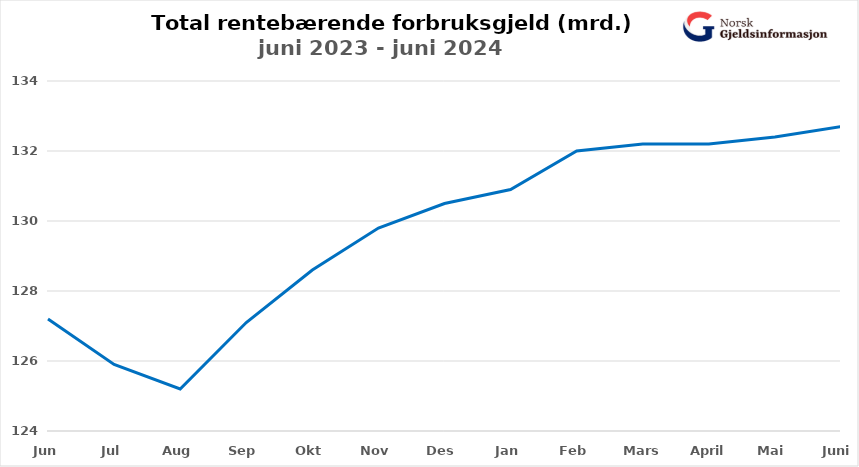
| Category | Rentebærende forbruksgjeld |
|---|---|
| Jun | 127.2 |
| Jul | 125.9 |
| Aug | 125.2 |
| Sep | 127.1 |
| Okt | 128.6 |
| Nov | 129.8 |
| Des | 130.5 |
| Jan | 130.9 |
| Feb | 132 |
| Mars | 132.2 |
| April | 132.2 |
| Mai | 132.4 |
| Juni | 132.7 |